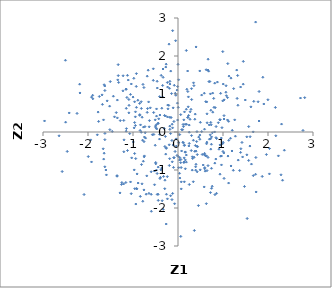
| Category | Series 0 |
|---|---|
| 2.03120851423108 | -1.102 |
| 0.6380926272378209 | 0.791 |
| 1.4215352233544785 | -0.276 |
| 0.0618896957430254 | -2.747 |
| 1.2871835639577025 | -3.195 |
| -1.0912993337554795 | 0.504 |
| 0.7930680771447751 | 0.884 |
| 0.8462634296984827 | 0.144 |
| 0.27058960232429025 | 0.532 |
| 0.584641239548479 | 1.021 |
| 1.2364435287591777 | 1.141 |
| 2.1742855629542954 | -0.099 |
| 0.3863876955118836 | -0.356 |
| -0.2788882041977651 | 0.423 |
| -0.23696091154944107 | -1.175 |
| 0.9925461143902533 | -0.306 |
| -1.0728897451103232 | -0.041 |
| 1.8713023107273214 | -1.17 |
| 0.9657842777513779 | -0.866 |
| 0.4147450287659612 | -0.251 |
| 0.05975740389826087 | -0.807 |
| 1.3254545573414571 | 1.487 |
| 0.37273713275025366 | -0.508 |
| -1.3186778673241994 | 1.305 |
| -0.7453621162487355 | -0.132 |
| -2.2430237134671027 | 0.489 |
| -0.8328264022142614 | 0.187 |
| 0.23135628487303236 | 0.924 |
| -0.3613692791000093 | -0.949 |
| 1.134409014168927 | 1.471 |
| -0.9085548721926571 | -1.103 |
| -0.10742648629825179 | -0.344 |
| -1.652052161703114 | -0.713 |
| 0.6679956220573496 | -0.668 |
| 0.15823453677162813 | 0.201 |
| -1.3715809611399337 | 0.511 |
| 0.5263265302888538 | 0.011 |
| -0.97220790066872 | -0.998 |
| -0.8493367787775357 | 0.456 |
| 0.1410190143220701 | -1.311 |
| 0.3930467419920333 | -1.004 |
| -1.5740185364087167 | 0.819 |
| -1.9400056026471983 | -0.208 |
| -1.5196097550640792 | 0.681 |
| -1.1492986922592545 | 0.623 |
| -0.26058699950445463 | -0.417 |
| -0.5232322655399885 | -1.028 |
| 0.6447142994476656 | -1.016 |
| -0.09943830213728103 | -0.932 |
| -1.5907675174995723 | -1.129 |
| -0.008364926096423737 | 0.315 |
| 0.48386190445106075 | 1.606 |
| 0.10229563728664204 | 0.06 |
| 0.965633094822023 | -0.632 |
| -0.35112947069924044 | -1.809 |
| -0.8148555747264425 | -0.007 |
| -0.9273283446574865 | 1.199 |
| 0.16307379601566113 | -0.735 |
| 1.9068514845797053 | 0.737 |
| -0.885749578718171 | -1.343 |
| -0.2565232240090893 | -1.639 |
| 0.1854646355270571 | -0.793 |
| -0.5481054931863547 | 1.663 |
| 1.3323276474267511 | 0.704 |
| 2.8156992451498764 | 0.903 |
| -1.247214070944625 | -1.331 |
| -2.1781296409141184 | 1.027 |
| -1.2049699411168855 | 0.304 |
| 0.48533245789821655 | -0.081 |
| -0.22814747345436087 | 0.71 |
| 0.538850646723118 | -0.592 |
| -0.7074288939866151 | -1.637 |
| 0.6046063527278297 | -1.03 |
| 0.6673271521674686 | 1.63 |
| -0.23301209197587175 | 0.396 |
| 1.2291107610464314 | -1.008 |
| 1.0228488442547026 | 0.342 |
| -1.0296401667276533 | -0.681 |
| 0.16189976953480814 | -0.533 |
| 0.937708650166596 | 0.32 |
| -0.30563871869331644 | 0.095 |
| 0.039771138110173715 | -0.675 |
| -1.5145159712610154 | 0.061 |
| -0.5919505054547642 | -2.086 |
| 0.9461397636297907 | -0.637 |
| -1.7748875279486203 | 0.524 |
| -0.11936705202457763 | -1.616 |
| -0.4634168051360489 | 1.335 |
| 1.965085368716691 | -0.593 |
| 0.8401632316051432 | -0.712 |
| -0.8414974713543812 | 0.042 |
| -1.6402911486849379 | 1.243 |
| 1.7796479881384117 | 0.796 |
| -0.08929741519572655 | 0.276 |
| -0.40924532624341775 | 0.931 |
| 0.3429393575789887 | -0.217 |
| -0.27264081102165105 | -0.582 |
| -0.8517087687031069 | 0.438 |
| -0.37370570140455733 | 1.49 |
| -0.476547050783232 | 0.607 |
| 0.40008693374644544 | -0.849 |
| -0.060421957189233995 | 1.019 |
| 0.7995662872111217 | 0.649 |
| 0.39215776956178894 | -0.916 |
| 0.3009875541715066 | -0.094 |
| 0.7704574229073521 | 1.024 |
| 0.28906624776493384 | 0.597 |
| 0.06446833580910417 | -0.723 |
| 0.728156360859254 | -0.451 |
| -1.7923624472891055 | -0.075 |
| 0.6807604722381256 | 1.601 |
| -2.497519738398751 | 0.259 |
| -0.7566583099842213 | 1.17 |
| 0.6982812051356887 | -0.188 |
| 0.26706845391375206 | 0.335 |
| -0.36017406429110804 | 0.626 |
| 1.5377600927129589 | -2.277 |
| 0.4214161121138919 | 0.01 |
| -0.19297654349107266 | -0.881 |
| 1.7248337317978 | 2.892 |
| -0.6627876932471145 | 1.626 |
| 0.5865276189380716 | -0.601 |
| 1.3702576745402866 | -1.014 |
| 0.4018738840208439 | 2.238 |
| -1.6548899417173972 | 0.319 |
| -0.45964475560049683 | 1.157 |
| 1.1277428742198505 | -0.218 |
| -0.7569702016612629 | -1.524 |
| 0.8962726876906973 | 0.244 |
| 0.13141079204823944 | -0.804 |
| -0.7992497752973948 | -1.364 |
| -1.354093013204005 | -1.149 |
| -0.02038424237595726 | 1.103 |
| -0.4020543587169101 | 0.447 |
| 2.3637858296864778 | -0.479 |
| 1.8017494110050138 | 1.066 |
| -1.6248903029922162 | -0.201 |
| 1.107535789450467 | 1.8 |
| 1.02511469022449 | 0.845 |
| 1.124490385677927 | 0.28 |
| -0.20452158779356414 | 0.702 |
| 0.21791251330639946 | 1.065 |
| 0.7603294801492564 | -1.428 |
| -1.1221912471282933 | -0.487 |
| -0.9473024651688603 | 0.399 |
| -0.6839311623696789 | 1.469 |
| 0.06006999809032871 | 0.457 |
| 0.74394610508488 | -0.956 |
| 0.012352982368187744 | -0.282 |
| -0.036660278153925294 | -0.371 |
| 0.8759512670555262 | 1.314 |
| 1.7371826693139243 | -1.578 |
| 0.9998305357418359 | -0.513 |
| -1.0396209677074673 | -1.623 |
| -0.4620714014825965 | -1.641 |
| -0.4434293036537461 | 0.222 |
| 1.7230553890210984 | -1.112 |
| -1.8965632460419617 | 0.966 |
| 1.6321263505984813 | -0.844 |
| 1.3044683222252125 | 1.63 |
| 0.6270576053918596 | 1.638 |
| -1.1990208308441903 | -0.206 |
| -0.8107079895781242 | -0.857 |
| -1.0547100080356224 | -1.314 |
| -1.2564277797134944 | -1.38 |
| -1.2231836051660467 | 1.083 |
| 0.2505121692383727 | -1.382 |
| -1.6794287548294566 | 0.727 |
| -0.161897620538353 | 1.603 |
| -0.4387068804111355 | -1.8 |
| 0.07042692341648597 | -0.936 |
| -0.15282315113330683 | 0.381 |
| 0.2193886782159087 | 0.385 |
| -0.9743392692940336 | 0.108 |
| 0.7225413625836373 | -1.594 |
| -0.1890637602398564 | 1.15 |
| -0.8367251421221276 | -1.694 |
| -1.3274569233412323 | 1.483 |
| -0.7351056484581358 | 0.142 |
| 0.16327254812980477 | -0.968 |
| 1.5706775862478974 | -0.748 |
| -0.2797782534020779 | -0.118 |
| -0.1644393758504463 | -0.04 |
| -0.4004850732525856 | -1.224 |
| 1.6708999540223062 | 0.003 |
| 1.7305088911863902 | -0.671 |
| -1.1051419062858445 | 1.368 |
| 2.322770487876884 | -1.269 |
| -0.18042515946923676 | 1.333 |
| -0.7703487089854117 | -0.769 |
| -0.684670462488979 | 0.517 |
| -1.686992137810337 | 0.977 |
| 2.721983637185016 | 0.894 |
| 0.7377783120565559 | 0.189 |
| 0.7427711868332664 | -0.323 |
| -0.012841215020552412 | 0.76 |
| 0.1400481435943803 | -0.355 |
| -0.4934629812035567 | -0.837 |
| 0.07258738315439299 | -1.497 |
| 1.477605541478177 | -1.434 |
| -0.9929209013687255 | -0.263 |
| -0.2348178730352613 | -1.759 |
| 0.2491505033797529 | 0.182 |
| -1.5051274356364979 | 1.327 |
| -1.150956721967325 | 0.021 |
| -0.537643223693889 | -0.064 |
| -1.6411467370087576 | -0.558 |
| -0.14312733058023439 | 1.011 |
| 0.6473122687963895 | 0.242 |
| 0.18446660798281334 | 2.144 |
| 0.7623350221390072 | -0.021 |
| -0.32774831379401514 | -2.033 |
| -2.6429426375321503 | -0.1 |
| -0.06514262615544474 | -0.512 |
| -2.461531669959255 | -0.512 |
| 1.8855890083727507 | 1.44 |
| 1.5288729477324603 | -0.128 |
| -0.34150597227342133 | 1.225 |
| -0.7205171014917541 | -0.161 |
| -1.7639146915076378 | 0.279 |
| 2.2309473395456876 | -0.628 |
| -1.055628881598338 | 0.99 |
| 1.1245676795719182 | -1.344 |
| -2.5738054900689793 | -1.04 |
| -0.9242831362350243 | -1.486 |
| 0.1223821104752984 | -0.287 |
| -1.3470978771586666 | 0.371 |
| -1.6243173671698863 | -0.036 |
| 0.7269526556662154 | -0.177 |
| 1.4517923454722974 | 1.858 |
| 0.35846074913876164 | -0.664 |
| 1.530766743200824 | -0.601 |
| 0.6411043289936558 | -0.267 |
| 0.930060546517262 | 0.325 |
| 1.4496550983388448 | 1.259 |
| 1.3973886770123323 | -0.44 |
| 1.495305630408304 | 0.842 |
| 0.4605828165743575 | -0.134 |
| 0.0009683490402720616 | 1.781 |
| 1.3386330393836674 | -0.739 |
| 0.18466531357444652 | 0.6 |
| 0.3255815486018691 | -0.698 |
| 0.8207917245757703 | -1.649 |
| 0.6300237274436138 | -1.886 |
| 0.21849207642636712 | 0.383 |
| -0.8525391313065561 | 0.753 |
| 1.0189097840616879 | -0.552 |
| 0.8580550240556609 | -0.173 |
| -0.5703243668184629 | -0.071 |
| -0.22290164902077086 | 0.609 |
| 0.7737841573645526 | 0.522 |
| -0.3329020734951593 | 1.658 |
| 0.014466404233050721 | -0.938 |
| -0.47932740461851436 | 0.192 |
| 1.166313108658835 | -0.165 |
| -1.2082964251904524 | -1.367 |
| 1.1782644466162628 | 1.418 |
| 0.582359482567699 | -1.446 |
| -0.998270020390144 | 0.919 |
| 1.6741657172903954 | -1.148 |
| 0.12951236497136356 | 0.319 |
| 0.24149042080330654 | -0.367 |
| -0.18139645717775035 | 0.386 |
| 0.29500544096791476 | -0.488 |
| 0.7172116966502751 | -0.074 |
| 1.3911014773454884 | 1.183 |
| 0.03713304754663213 | -0.068 |
| -0.39100588903861505 | -1.194 |
| 0.08205308102389465 | 0.062 |
| -0.6399167408872265 | 0.136 |
| 1.2060936940360398 | 0.045 |
| -0.44075235989616585 | -1.64 |
| 2.164516187592801 | 0.647 |
| 0.13786097870815767 | -0.681 |
| -0.13467100871409543 | -0.223 |
| -1.3543679057872855 | -1.164 |
| -0.5004078524427933 | 0.156 |
| -0.3416345512434298 | 0.919 |
| 2.7777519810874005 | 0.04 |
| -0.1341500688076392 | -1.779 |
| -0.9601454968847273 | -1.492 |
| 1.065451192941444 | 1.047 |
| 0.7200896984920314 | 1.003 |
| 0.07952149311321782 | -0.499 |
| -0.5057784826144435 | -0.349 |
| 0.6675006922701778 | -0.885 |
| 0.8183338133844088 | -0.819 |
| 0.1346299387039487 | -0.791 |
| -0.18195284645186643 | 0.155 |
| 1.199997028593207 | -0.5 |
| 0.4293996564606899 | -0.595 |
| 0.0728032796922534 | -1.312 |
| -0.5405796804086312 | 0.512 |
| 0.24994116763161509 | -0.006 |
| 0.745408430749935 | -0.129 |
| 0.5912504489032662 | -0.562 |
| 0.424812553827198 | -0.376 |
| -0.04837940584732547 | 0.967 |
| 0.6877498062760925 | 1.327 |
| -0.43954886591281284 | -0.923 |
| 0.9954353611717833 | 2.116 |
| 0.8140417253766462 | 0.002 |
| -0.5954940584783552 | -1.047 |
| -0.4950673498922876 | -0.803 |
| -0.19877019459649387 | 2.312 |
| -1.2037998834773542 | -0.52 |
| -0.9449634964392402 | 0.531 |
| 0.30371903593215327 | 0.853 |
| 0.633009725398936 | -0.629 |
| 0.19031663947288083 | 0.203 |
| 0.7318729255203008 | 0.572 |
| 0.993985624217695 | 0.818 |
| -0.036864504043420766 | -0.181 |
| -0.9394030630191293 | -0.7 |
| 0.013533401087857526 | 1.373 |
| -0.18563038882263722 | -0.702 |
| -2.4170549401792125 | 0.501 |
| -1.0921739170660414 | 0.856 |
| 0.4335274350143891 | -0.389 |
| -1.7488944741817858 | 0.935 |
| -0.5057635131311345 | 0.319 |
| -0.9248015867194376 | 1.536 |
| -0.6940834797407236 | -1.155 |
| 0.9317173821395797 | -0.341 |
| 0.5930083537873714 | -0.968 |
| -0.29990974688999067 | 0.435 |
| -0.981614578872564 | 1.413 |
| -0.26290511926410376 | 1.785 |
| -0.9124929484648598 | -1.496 |
| 0.23572114740063294 | 0.437 |
| -1.1540884249497219 | 1.12 |
| -0.020744435640049352 | -0.616 |
| 0.12172405562661838 | 0.141 |
| -1.3295708914959001 | 1.772 |
| -1.3473858143056996 | 0.84 |
| 0.9470196670188338 | 1.017 |
| -0.5489218937078486 | 1.36 |
| 1.9992044398148632 | 0.849 |
| -0.7871500930391641 | -0.215 |
| 0.0058951784768085744 | 0.65 |
| -1.4616844609789088 | 0.015 |
| -0.28986976053490254 | -1.269 |
| 0.8157064643144257 | 1.285 |
| -0.2910733426304776 | -0.382 |
| 0.2277374185401185 | 0.663 |
| -0.4105093488334182 | -0.186 |
| -0.29394779858041803 | -1.493 |
| -0.6532174471195247 | 0.792 |
| -0.0862373369672945 | -0.674 |
| 0.3173431265591577 | -1.003 |
| 1.1013125204922698 | 0.905 |
| 0.006140326447311107 | -0.644 |
| -0.4768000741331179 | 0.419 |
| 0.32011671439693934 | -0.653 |
| 0.6178100060176094 | 0.799 |
| 0.4260579797188015 | -1.047 |
| 1.0751025652010318 | 0.956 |
| 0.1439486127769097 | -0.344 |
| -0.10716327246990236 | 0.635 |
| 0.03308653354793722 | -1.087 |
| -0.12078024508411091 | 0.109 |
| -0.18054337034168894 | 0.069 |
| 0.6937106047405537 | 0.187 |
| 2.2894471039196915 | -1.126 |
| -1.1594466017193161 | -1.329 |
| 1.0240311386956915 | -1.221 |
| 0.1971505121506946 | 1.124 |
| -1.1341601451981531 | 0.908 |
| 0.6346789868596819 | -0.311 |
| -0.3205978396403933 | -1.169 |
| -0.17944249516405425 | 1.262 |
| -0.4400805502876557 | 0.234 |
| 1.3140000217917003 | 0.884 |
| 0.6108421128553749 | -0.625 |
| -0.5955834725669198 | -1.64 |
| 0.855615215297404 | -1.614 |
| 1.1782188226554546 | -0.894 |
| -0.7972328177831958 | 0.389 |
| -1.4109622924836602 | 0.399 |
| -1.625612037393271 | -0.916 |
| 0.7278956877688509 | 0.252 |
| -0.5218045139452976 | -1.388 |
| 0.7070654520583484 | 1.328 |
| 1.6200741334289184 | 0.662 |
| 1.0038938931000294 | -0.272 |
| 0.34555199237786 | 1.294 |
| -0.26047740452521856 | -0.431 |
| -0.33065309071101906 | 1.439 |
| 0.5610930209270284 | -0.868 |
| 0.6448294316121703 | 0.478 |
| -0.7291953074585305 | -0.019 |
| 0.1627098468214491 | -0.524 |
| 0.10806705513290601 | -0.269 |
| -0.23066185847236864 | 1.183 |
| -0.13058077078449953 | 0.204 |
| 0.3738043040154474 | 0.336 |
| -0.7519250832502837 | -0.654 |
| -0.2711860943194124 | 1.709 |
| -0.4283547791153228 | 0.347 |
| 2.3011745348395247 | 0.208 |
| 1.1107377198049238 | -0.634 |
| 0.5255544155751644 | 0.971 |
| -0.008436983143597355 | 1.195 |
| -2.0876174370063887 | -1.645 |
| 0.033365693322464786 | -0.738 |
| -0.38038846715918156 | -0.996 |
| -1.892933264321624 | 0.874 |
| -1.624891904438697 | 1.092 |
| 0.49441417604134263 | -0.997 |
| 0.45406087381067256 | -1.937 |
| -0.23579583923886455 | 1.302 |
| 0.8441681775780651 | -0.148 |
| -1.9217714432936246 | -0.788 |
| -0.6765609200648942 | 0.616 |
| 0.3003734460664268 | 1.14 |
| 2.033859787535725 | -0.435 |
| 1.2755266423605045 | -0.109 |
| 0.2138581497499271 | 1.605 |
| -0.4790820664832568 | -1.003 |
| -0.1949523627932929 | -0.337 |
| -0.964569351903321 | 0.795 |
| -0.7828296145319283 | -1.822 |
| 0.401881140982674 | -0.504 |
| 0.33972314142154586 | -1.309 |
| 0.9623404707138572 | -0.159 |
| 1.0998468982848153 | 0.317 |
| -0.9639430109561117 | -0.567 |
| -0.8141293854772979 | 0.621 |
| 1.3911195833647891 | -0.537 |
| -1.1458534542879175 | 0.088 |
| -0.9463728537393533 | 0.171 |
| -1.3391975463264034 | 1.371 |
| 1.5712879758537097 | 0.143 |
| 0.589297844878256 | 0.074 |
| 0.3533681685030862 | 1.22 |
| -0.9374571678937006 | -1.896 |
| 0.5946823053230665 | -0.937 |
| 0.04165595418333012 | -1.212 |
| 1.0681359154028924 | 1.217 |
| 1.800937958205329 | 0.289 |
| -0.63431289390713 | 0.3 |
| -1.0874186199935965 | 0.702 |
| -0.09380515146080738 | -0.678 |
| -1.2825502376332092 | 0.3 |
| -1.288866934538377 | -1.603 |
| -0.16421377021390554 | -1.678 |
| -1.0374690937460773 | 1.264 |
| 0.9773195044921432 | 0.114 |
| 0.3831371519529941 | 0.471 |
| 0.668574057785756 | 1.915 |
| -2.500952602091171 | 1.888 |
| -0.6148336134026382 | 0.636 |
| 1.435324656595383 | -0.657 |
| -1.219514510356616 | 1.48 |
| -0.05292181436573296 | 2.402 |
| -0.4096523796771581 | -0.062 |
| 1.5976749934521814 | -0.37 |
| -0.47225388585296557 | 0.08 |
| 0.18493965334009704 | -0.606 |
| -0.7465162956745369 | -0.629 |
| -0.08236159391264086 | 1.229 |
| -0.7779508429586933 | 1.252 |
| -1.6025862443710306 | -1 |
| 1.259413293618899 | 0.32 |
| -1.9937018746077526 | -0.647 |
| -1.9202943591028194 | 0.918 |
| 0.14454123837671695 | 0.529 |
| -2.9657393285675475 | 0.291 |
| -1.1231387273967208 | 1.491 |
| -0.26159493985111765 | -2.422 |
| -1.1521565816476766 | 1.131 |
| 1.0058882875708581 | 1.262 |
| -0.46286098790990254 | -1.092 |
| 1.6846513963315393 | 0.807 |
| 0.11327751192596962 | 0.2 |
| -0.8921608953594743 | 0.837 |
| -0.7548952385625379 | -0.253 |
| -0.6463512560012521 | -1.615 |
| -0.8173111858155767 | 0.797 |
| 0.9336284328497383 | -1.11 |
| -0.12696671593190867 | -0.784 |
| 0.363596371643133 | -2.592 |
| -1.6268306238595134 | 1.211 |
| -0.4951302033603606 | 0.111 |
| -1.6620016940642666 | -0.442 |
| 0.48554055790377393 | -0.19 |
| -0.9636412412212333 | 0.249 |
| 0.7452763424068695 | -1.482 |
| -2.1854440336400796 | 1.258 |
| -0.07599688798176545 | -1.888 |
| 1.6025362732713453 | -0.123 |
| 0.911186722207672 | -0.453 |
| 1.0229837254403356 | 0.431 |
| -0.9236478993403013 | 0.649 |
| -1.4360056662746923 | 0.942 |
| 0.8276809167523478 | 0.641 |
| -0.11950311065949533 | 2.666 |
| 0.25001835921090343 | -0.302 |
| 0.49754581575426676 | 0.254 |
| -0.7666673433153001 | 0.129 |